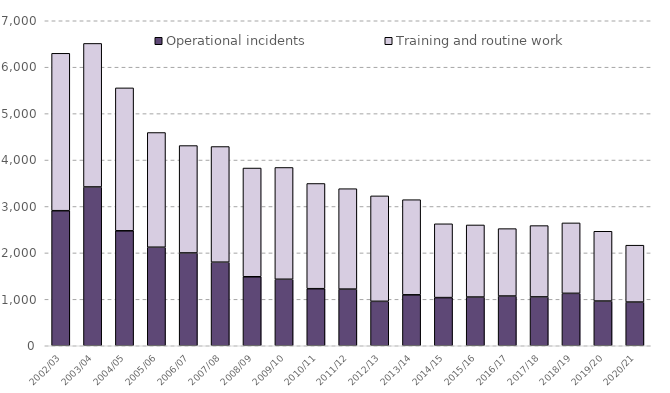
| Category | Operational incidents | Training and routine work |
|---|---|---|
| 2002/03 | 2909 | 3390 |
| 2003/04 | 3420 | 3092 |
| 2004/05 | 2476 | 3078 |
| 2005/06 | 2122 | 2471 |
| 2006/07 | 1999 | 2313 |
| 2007/08 | 1800 | 2491 |
| 2008/09 | 1486 | 2342 |
| 2009/10 | 1432 | 2408 |
| 2010/11 | 1229 | 2266 |
| 2011/12 | 1220 | 2163 |
| 2012/13 | 957 | 2271 |
| 2013/14 | 1097 | 2049 |
| 2014/15 | 1037 | 1590 |
| 2015/16 | 1049 | 1553 |
| 2016/17 | 1071 | 1452 |
| 2017/18 | 1052 | 1536 |
| 2018/19 | 1129 | 1517 |
| 2019/20 | 963 | 1503 |
| 2020/21 | 941 | 1225 |